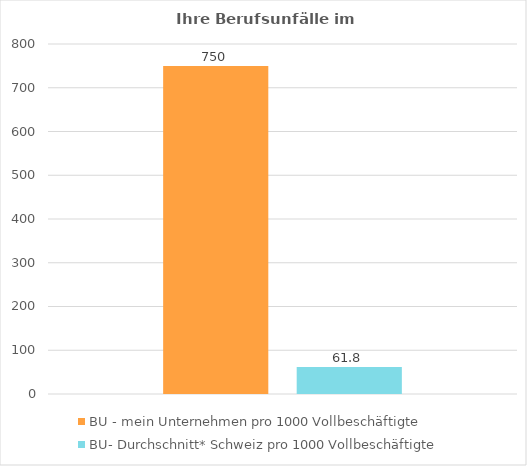
| Category | BU - mein Unternehmen pro 1000 Vollbeschäftigte | BU- Durchschnitt* Schweiz pro 1000 Vollbeschäftigte |
|---|---|---|
| Fallrisiko 
(Umrechung auf 1000 Vollbeschäftigte) | 750 | 61.8 |